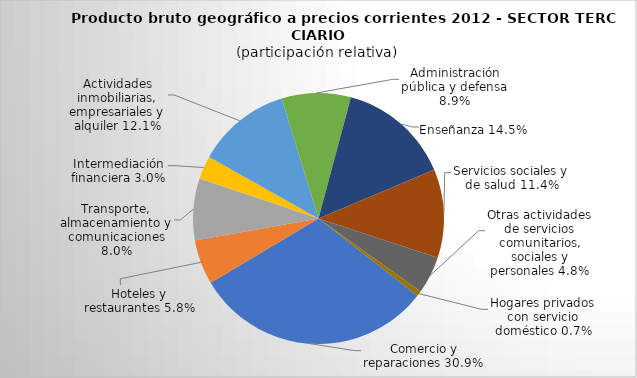
| Category | Series 0 |
|---|---|
| Comercio y reparaciones | 4575.567 |
| Hoteles y restaurantes | 853.539 |
| Transporte, almacenamiento y comunicaciones | 1180.633 |
| Intermediación financiera | 440.368 |
| Actividades inmobiliarias, empresariales y alquiler | 1795.874 |
| Administración pública y defensa | 1318.43 |
| Enseñanza | 2148.299 |
| Servicios sociales y de salud | 1689.677 |
| Otras actividades de servicios comunitarios, sociales y personales | 712.74 |
| Hogares privados con servicio doméstico | 100.181 |